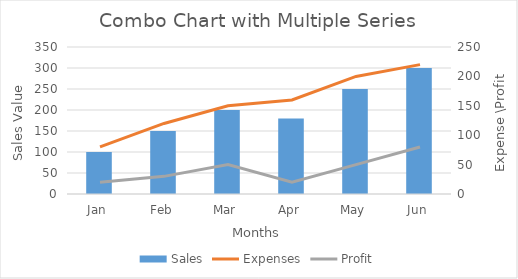
| Category | Sales |
|---|---|
| Jan | 100 |
| Feb | 150 |
| Mar | 200 |
| Apr | 180 |
| May | 250 |
| Jun | 300 |